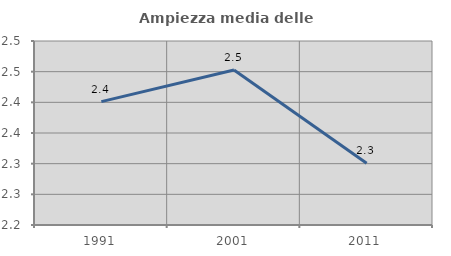
| Category | Ampiezza media delle famiglie |
|---|---|
| 1991.0 | 2.401 |
| 2001.0 | 2.453 |
| 2011.0 | 2.301 |